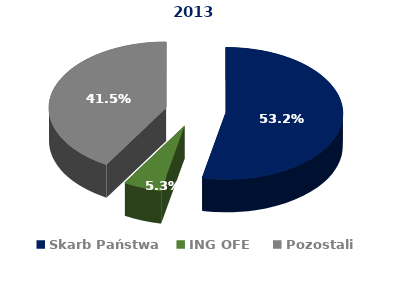
| Category | 2013 |
|---|---|
| Skarb Państwa | 0.532 |
| ING OFE | 0.053 |
| Pozostali | 0.415 |